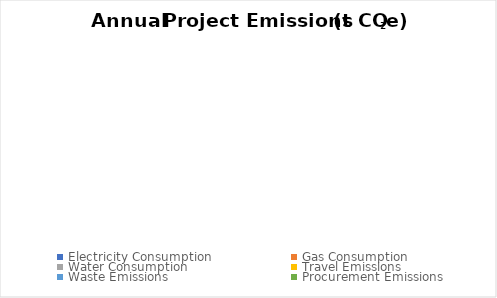
| Category | Emissions (t CO2e) | Percentage |
|---|---|---|
| Electricity Consumption | 0 | 0 |
| Gas Consumption | 0 | 0 |
| Water Consumption | 0 | 0 |
| Travel Emissions | 0 | 0 |
| Waste Emissions | 0 | 0 |
| Procurement Emissions | 0 | 0 |